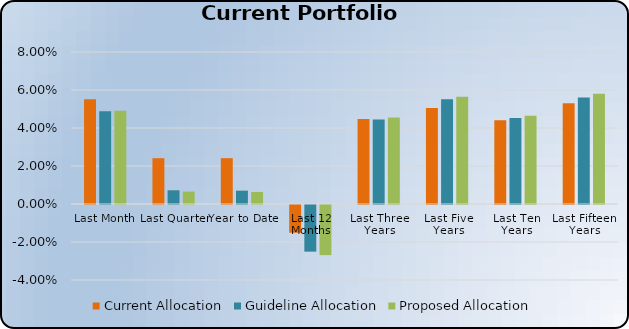
| Category | Current Allocation | Guideline Allocation | Proposed Allocation |
|---|---|---|---|
| Last Month | 0.055 | 0.049 | 0.049 |
| Last Quarter | 0.024 | 0.007 | 0.007 |
| Year to Date | 0.024 | 0.007 | 0.006 |
| Last 12 Months | -0.015 | -0.025 | -0.026 |
| Last Three Years | 0.045 | 0.045 | 0.046 |
| Last Five Years | 0.05 | 0.055 | 0.056 |
| Last Ten Years | 0.044 | 0.045 | 0.047 |
| Last Fifteen Years | 0.053 | 0.056 | 0.058 |